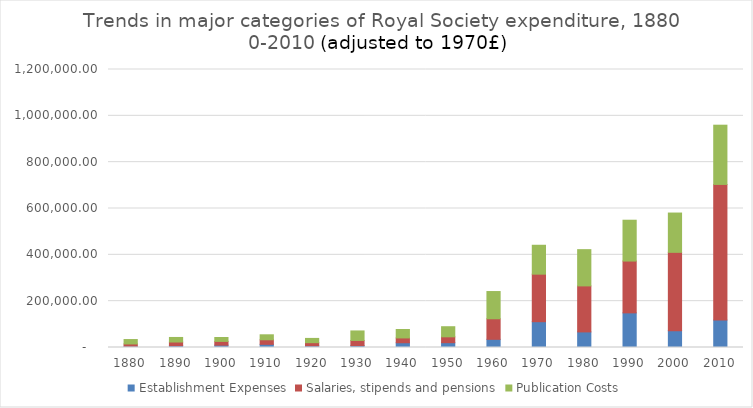
| Category | Establishment Expenses | Salaries, stipends and pensions | Publication Costs |
|---|---|---|---|
| 1880.0 | 5538.527 | 9784.496 | 19053.128 |
| 1890.0 | 7857.35 | 15765.288 | 19727.339 |
| 1900.0 | 10081.134 | 16257.052 | 16923.943 |
| 1910.0 | 13595.119 | 19735.229 | 21511.716 |
| 1920.0 | 7467.503 | 13337.54 | 18422.628 |
| 1930.0 | 8218.156 | 22198.11 | 41073.473 |
| 1940.0 | 20539.363 | 20713.625 | 36468.848 |
| 1950.0 | 20794.609 | 25249.021 | 43668.869 |
| 1960.0 | 35323.342 | 88675.993 | 117573.211 |
| 1970.0 | 111334 | 205196 | 124783 |
| 1980.0 | 67237.393 | 198660.168 | 156484.266 |
| 1990.0 | 149471.614 | 223667.249 | 176266.775 |
| 2000.0 | 72644.59 | 338085.266 | 169651.696 |
| 2010.0 | 118183.648 | 585690.392 | 255736.045 |